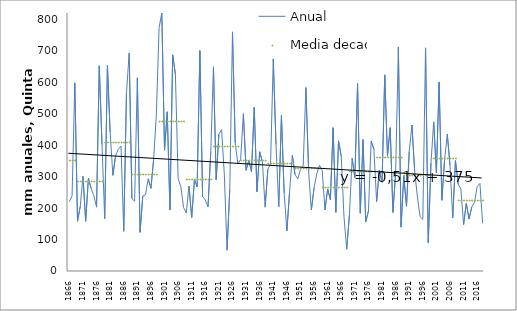
| Category | Anual | Media decadal |
|---|---|---|
| 1866.0 | 220 | 352.333 |
| 1867.0 | 239 | 352.333 |
| 1868.0 | 598 | 352.333 |
| 1869.0 | 158 | 287.6 |
| 1870.0 | 205 | 287.6 |
| 1871.0 | 301 | 287.6 |
| 1872.0 | 158 | 287.6 |
| 1873.0 | 295 | 287.6 |
| 1874.0 | 263 | 287.6 |
| 1875.0 | 239 | 287.6 |
| 1876.0 | 203 | 287.6 |
| 1877.0 | 652 | 287.6 |
| 1878.0 | 402 | 287.6 |
| 1879.0 | 166 | 409.7 |
| 1880.0 | 653 | 409.7 |
| 1881.0 | 441 | 409.7 |
| 1882.0 | 304 | 409.7 |
| 1883.0 | 366 | 409.7 |
| 1884.0 | 387 | 409.7 |
| 1885.0 | 397 | 409.7 |
| 1886.0 | 126 | 409.7 |
| 1887.0 | 564 | 409.7 |
| 1888.0 | 693 | 409.7 |
| 1889.0 | 230 | 307.8 |
| 1890.0 | 222 | 307.8 |
| 1891.0 | 614 | 307.8 |
| 1892.0 | 123 | 307.8 |
| 1893.0 | 238 | 307.8 |
| 1894.0 | 242 | 307.8 |
| 1895.0 | 293 | 307.8 |
| 1896.0 | 263 | 307.8 |
| 1897.0 | 355 | 307.8 |
| 1898.0 | 498 | 307.8 |
| 1899.0 | 773 | 475.4 |
| 1900.0 | 820 | 475.4 |
| 1901.0 | 384 | 475.4 |
| 1902.0 | 506 | 475.4 |
| 1903.0 | 194 | 475.4 |
| 1904.0 | 687 | 475.4 |
| 1905.0 | 626 | 475.4 |
| 1906.0 | 294 | 475.4 |
| 1907.0 | 268 | 475.4 |
| 1908.0 | 202 | 475.4 |
| 1909.0 | 184 | 292.52 |
| 1910.0 | 270 | 292.52 |
| 1911.0 | 170 | 292.52 |
| 1912.0 | 291 | 292.52 |
| 1913.0 | 267 | 292.52 |
| 1914.0 | 700.5 | 292.52 |
| 1915.0 | 236.8 | 292.52 |
| 1916.0 | 225.3 | 292.52 |
| 1917.0 | 203.8 | 292.52 |
| 1918.0 | 376.8 | 292.52 |
| 1919.0 | 649 | 396 |
| 1920.0 | 290 | 396 |
| 1921.0 | 435 | 396 |
| 1922.0 | 449 | 396 |
| 1923.0 | 306 | 396 |
| 1924.0 | 66 | 396 |
| 1925.0 | 259 | 396 |
| 1926.0 | 760 | 396 |
| 1927.0 | 406 | 396 |
| 1928.0 | 340 | 396 |
| 1929.0 | 355 | 354.3 |
| 1930.0 | 500 | 354.3 |
| 1931.0 | 320 | 354.3 |
| 1932.0 | 351 | 354.3 |
| 1933.0 | 316 | 354.3 |
| 1934.0 | 520 | 354.3 |
| 1935.0 | 252 | 354.3 |
| 1936.0 | 379 | 354.3 |
| 1937.0 | 347 | 354.3 |
| 1938.0 | 203 | 354.3 |
| 1939.0 | 323 | 343.27 |
| 1940.0 | 340 | 343.27 |
| 1941.0 | 674 | 343.27 |
| 1942.0 | 402 | 343.27 |
| 1943.0 | 204 | 343.27 |
| 1944.0 | 494 | 343.27 |
| 1945.0 | 247.2 | 343.27 |
| 1946.0 | 127.3 | 343.27 |
| 1947.0 | 253.3 | 343.27 |
| 1948.0 | 367.9 | 343.27 |
| 1949.0 | 306.5 | 325.88 |
| 1950.0 | 292.7 | 325.88 |
| 1951.0 | 322.9 | 325.88 |
| 1952.0 | 334.4 | 325.88 |
| 1953.0 | 583 | 325.88 |
| 1954.0 | 316.2 | 325.88 |
| 1955.0 | 193.9 | 325.88 |
| 1956.0 | 264 | 325.88 |
| 1957.0 | 309.4 | 325.88 |
| 1958.0 | 335.8 | 325.88 |
| 1959.0 | 319.7 | 266.29 |
| 1960.0 | 193.9 | 266.29 |
| 1961.0 | 260.9 | 266.29 |
| 1962.0 | 226.6 | 266.29 |
| 1963.0 | 455.5 | 266.29 |
| 1964.0 | 186.5 | 266.29 |
| 1965.0 | 413.7 | 266.29 |
| 1966.0 | 364.1 | 266.29 |
| 1967.0 | 172.8 | 266.29 |
| 1968.0 | 69.2 | 266.29 |
| 1969.0 | 178.3 | 317.57 |
| 1970.0 | 358.2 | 317.57 |
| 1971.0 | 296.3 | 317.57 |
| 1972.0 | 595.3 | 317.57 |
| 1973.0 | 183.5 | 317.57 |
| 1974.0 | 417.5 | 317.57 |
| 1975.0 | 156.2 | 317.57 |
| 1976.0 | 190.5 | 317.57 |
| 1977.0 | 412.6 | 317.57 |
| 1978.0 | 387.3 | 317.57 |
| 1979.0 | 220.5 | 361.64 |
| 1980.0 | 320.8 | 361.64 |
| 1981.0 | 281.9 | 361.64 |
| 1982.0 | 623.4 | 361.64 |
| 1983.0 | 365.1 | 361.64 |
| 1984.0 | 455.5 | 361.64 |
| 1985.0 | 186.2 | 361.64 |
| 1986.0 | 311.3 | 361.64 |
| 1987.0 | 712.1 | 361.64 |
| 1988.0 | 139.6 | 361.64 |
| 1989.0 | 302.5 | 303.97 |
| 1990.0 | 205.8 | 303.97 |
| 1991.0 | 379.6 | 303.97 |
| 1992.0 | 464 | 303.97 |
| 1993.0 | 316.7 | 303.97 |
| 1994.0 | 236 | 303.97 |
| 1995.0 | 172.5 | 303.97 |
| 1996.0 | 164 | 303.97 |
| 1997.0 | 709.3 | 303.97 |
| 1998.0 | 89.3 | 303.97 |
| 1999.0 | 343.2 | 359.82 |
| 2000.0 | 473.9 | 359.82 |
| 2001.0 | 311.9 | 359.82 |
| 2002.0 | 600.8 | 359.82 |
| 2003.0 | 224.9 | 359.82 |
| 2004.0 | 353.8 | 359.82 |
| 2005.0 | 434.9 | 359.82 |
| 2006.0 | 335.6 | 359.82 |
| 2007.0 | 168.4 | 359.82 |
| 2008.0 | 350.8 | 359.82 |
| 2009.0 | 276.8 | 225.856 |
| 2010.0 | 259.5 | 225.856 |
| 2011.0 | 147.5 | 225.856 |
| 2012.0 | 215.8 | 225.856 |
| 2013.0 | 165.1 | 225.856 |
| 2014.0 | 203.4 | 225.856 |
| 2015.0 | 217.5 | 225.856 |
| 2016.0 | 268.7 | 225.856 |
| 2017.0 | 278.4 | 225.856 |
| 2018.0 | 151.4 | 225.856 |